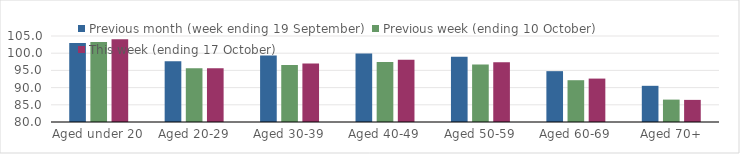
| Category | Previous month (week ending 19 September) | Previous week (ending 10 October) | This week (ending 17 October) |
|---|---|---|---|
| Aged under 20 | 102.98 | 103.25 | 104.04 |
| Aged 20-29 | 97.69 | 95.66 | 95.62 |
| Aged 30-39 | 99.32 | 96.58 | 96.99 |
| Aged 40-49 | 99.94 | 97.45 | 98.12 |
| Aged 50-59 | 98.98 | 96.69 | 97.35 |
| Aged 60-69 | 94.78 | 92.15 | 92.62 |
| Aged 70+ | 90.52 | 86.51 | 86.43 |